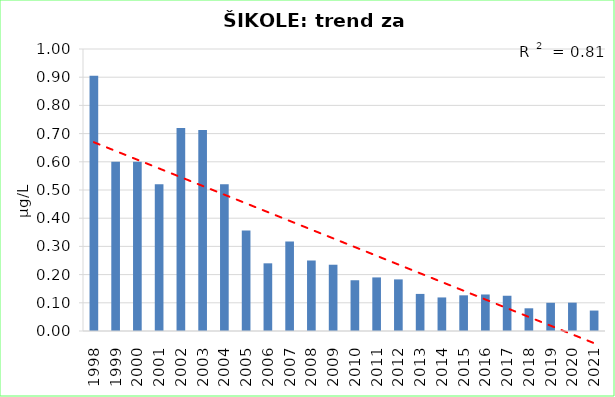
| Category | Vsota |
|---|---|
| 1998 | 0.905 |
| 1999 | 0.6 |
| 2000 | 0.6 |
| 2001 | 0.52 |
| 2002 | 0.72 |
| 2003 | 0.712 |
| 2004 | 0.52 |
| 2005 | 0.357 |
| 2006 | 0.24 |
| 2007 | 0.318 |
| 2008 | 0.25 |
| 2009 | 0.235 |
| 2010 | 0.18 |
| 2011 | 0.19 |
| 2012 | 0.183 |
| 2013 | 0.132 |
| 2014 | 0.119 |
| 2015 | 0.126 |
| 2016 | 0.13 |
| 2017 | 0.125 |
| 2018 | 0.08 |
| 2019 | 0.1 |
| 2020 | 0.1 |
| 2021 | 0.072 |